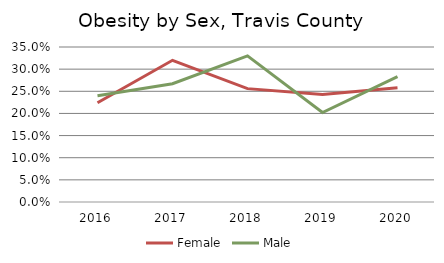
| Category | Female | Male |
|---|---|---|
| 2016.0 | 0.224 | 0.24 |
| 2017.0 | 0.32 | 0.267 |
| 2018.0 | 0.256 | 0.33 |
| 2019.0 | 0.243 | 0.202 |
| 2020.0 | 0.258 | 0.283 |